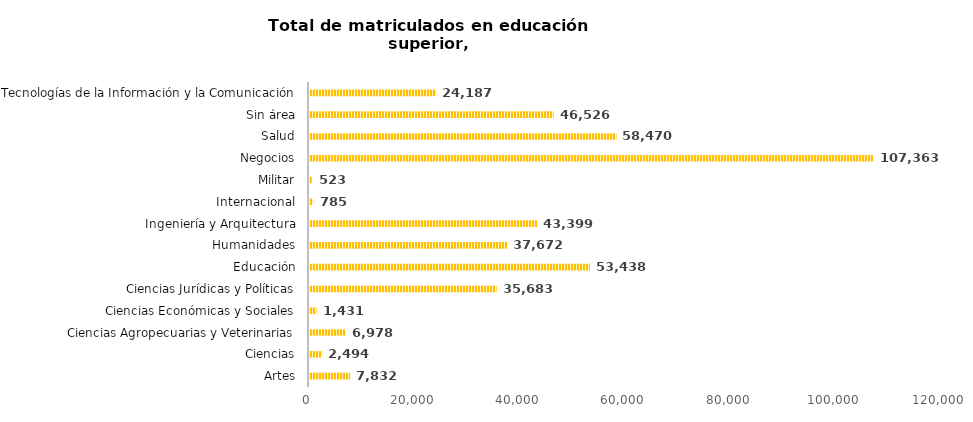
| Category | Series 0 |
|---|---|
| Artes | 7832 |
| Ciencias | 2494 |
| Ciencias Agropecuarias y Veterinarias | 6978 |
| Ciencias Económicas y Sociales | 1431 |
| Ciencias Jurídicas y Políticas | 35683 |
| Educación | 53438 |
| Humanidades | 37672 |
| Ingeniería y Arquitectura | 43399 |
| Internacional | 785 |
| Militar | 523 |
| Negocios | 107363 |
| Salud | 58470 |
| Sin área | 46526 |
| Tecnologías de la Información y la Comunicación | 24187 |